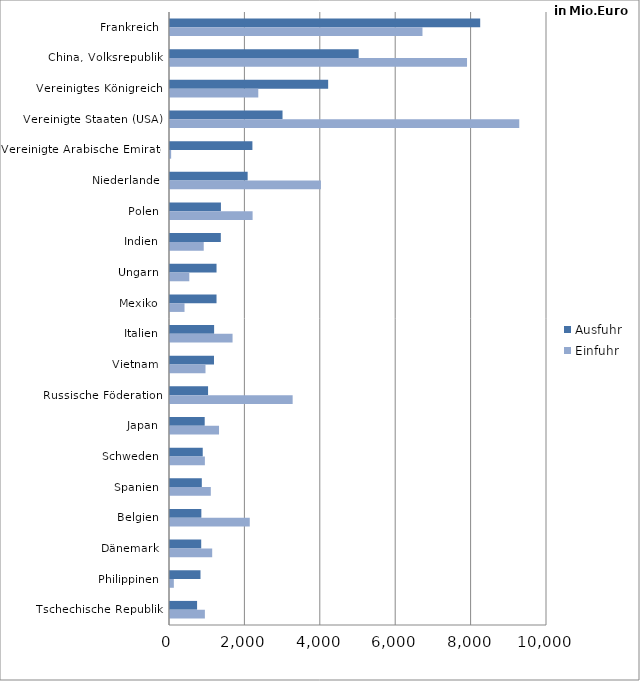
| Category | Ausfuhr | Einfuhr |
|---|---|---|
| Frankreich | 8228.17 | 6697.037 |
| China, Volksrepublik | 5003.969 | 7878.686 |
| Vereinigtes Königreich | 4195.215 | 2341.879 |
| Vereinigte Staaten (USA) | 2984.837 | 9264.079 |
| Vereinigte Arabische Emirate | 2185.879 | 30.437 |
| Niederlande | 2059.574 | 4002.861 |
| Polen | 1351.06 | 2190.97 |
| Indien | 1347.856 | 894.695 |
| Ungarn | 1234.277 | 512.087 |
| Mexiko | 1234.067 | 385.085 |
| Italien | 1170.2 | 1659.444 |
| Vietnam | 1166.814 | 941.833 |
| Russische Föderation | 1009.62 | 3253.209 |
| Japan | 920.417 | 1300.438 |
| Schweden | 868.231 | 925.201 |
| Spanien | 843.824 | 1082.561 |
| Belgien | 831.529 | 2115.992 |
| Dänemark | 827.884 | 1119.176 |
| Philippinen | 808.84 | 101.876 |
| Tschechische Republik | 718.409 | 925.326 |